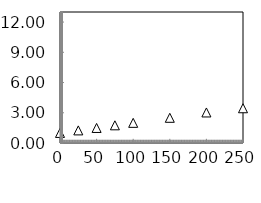
| Category | Series 2 |
|---|---|
| 0.0 | 1 |
| 25.0 | 1.25 |
| 50.0 | 1.493 |
| 75.0 | 1.754 |
| 100.0 | 2 |
| 150.0 | 2.5 |
| 200.0 | 3.03 |
| 250.0 | 3.448 |